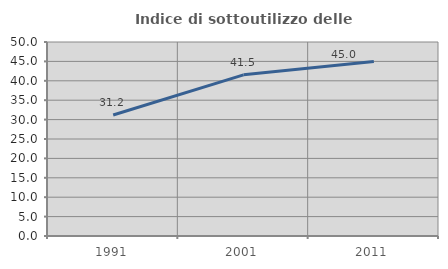
| Category | Indice di sottoutilizzo delle abitazioni  |
|---|---|
| 1991.0 | 31.173 |
| 2001.0 | 41.54 |
| 2011.0 | 45 |